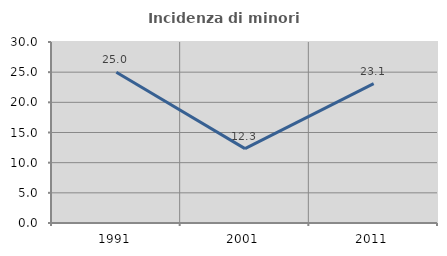
| Category | Incidenza di minori stranieri |
|---|---|
| 1991.0 | 25 |
| 2001.0 | 12.329 |
| 2011.0 | 23.111 |